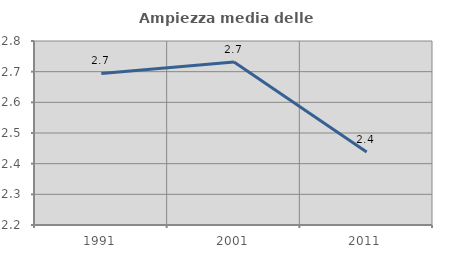
| Category | Ampiezza media delle famiglie |
|---|---|
| 1991.0 | 2.694 |
| 2001.0 | 2.732 |
| 2011.0 | 2.438 |